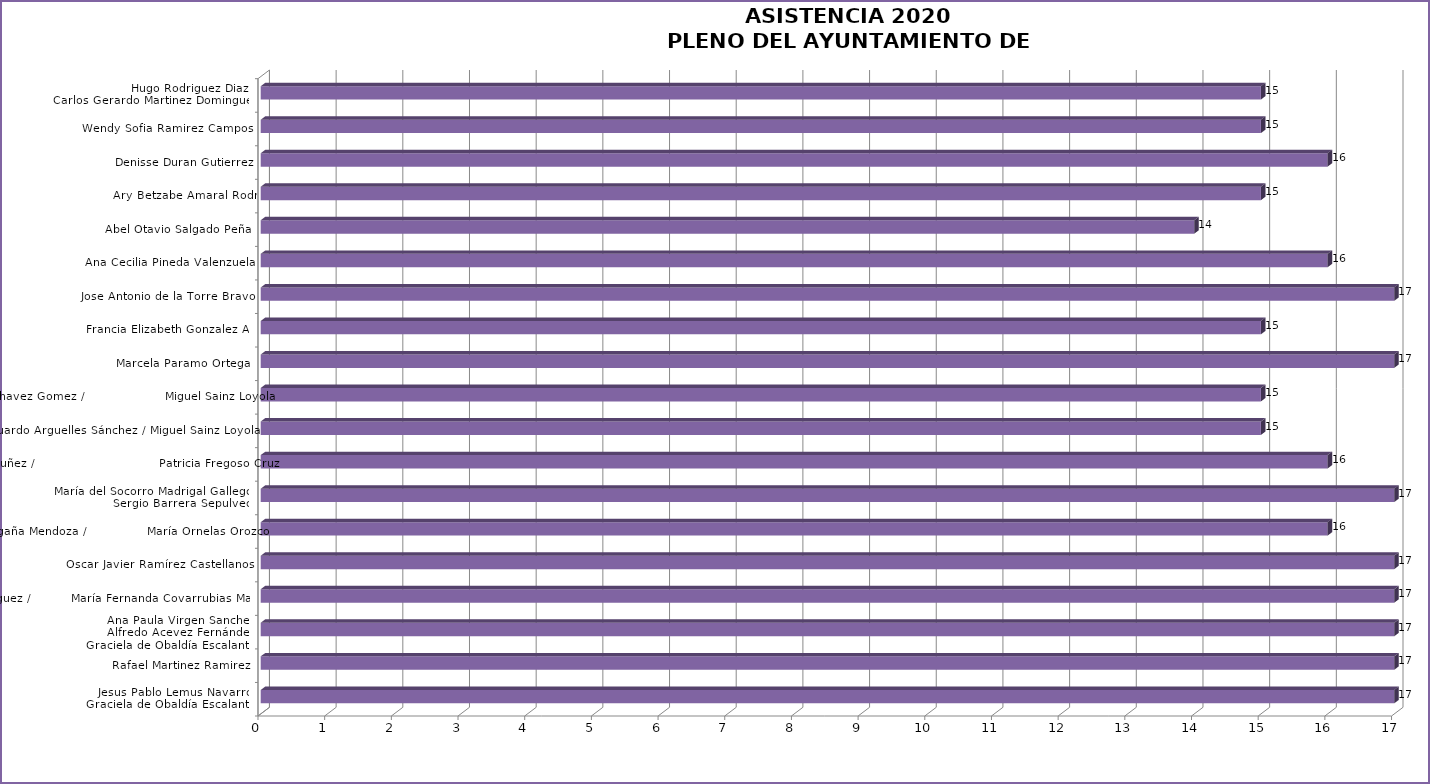
| Category | Series 0 |
|---|---|
| Jesus Pablo Lemus Navarro /
Graciela de Obaldía Escalante  | 17 |
| Rafael Martinez Ramirez  | 17 |
| Ana Paula Virgen Sanchez/
Alfredo Acevez Fernández/
Graciela de Obaldía Escalante  | 17 |
| Laura Gabriela Cárdenas Rodríguez /          María Fernanda Covarrubias Marrufo | 17 |
| Oscar Javier Ramírez Castellanos  | 17 |
| Monica Paola Magaña Mendoza /               María Ornelas Orozco  | 16 |
| María del Socorro Madrigal Gallegos/
Sergio Barrera Sepulveda | 17 |
| Melina Alatorre Nuñez /                               Patricia Fregoso Cruz | 16 |
| Ivan Eduardo Arguelles Sánchez / Miguel Sainz Loyola  | 15 |
| Ivan Ricardo Chavez Gomez /                    Miguel Sainz Loyola | 15 |
| Marcela Paramo Ortega  | 17 |
| Maria Gomez Rueda/                                     Francia Elizabeth Gonzalez Alatorre | 15 |
| Jose Antonio de la Torre Bravo  | 17 |
| Ana Cecilia Pineda Valenzuela | 16 |
| Abel Otavio Salgado Peña  | 14 |
| Jose Hiram Torres Salcedo/                                 Ary Betzabe Amaral Rodríguez | 15 |
| Denisse Duran Gutierrez | 16 |
| Wendy Sofia Ramirez Campos  | 15 |
| Hugo Rodriguez Diaz /
Carlos Gerardo Martinez Dominguez  | 15 |